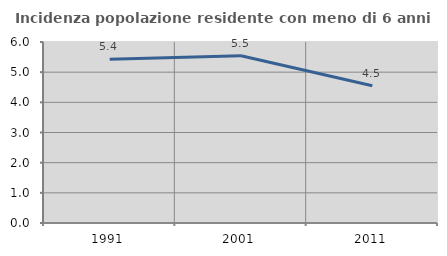
| Category | Incidenza popolazione residente con meno di 6 anni |
|---|---|
| 1991.0 | 5.432 |
| 2001.0 | 5.542 |
| 2011.0 | 4.548 |